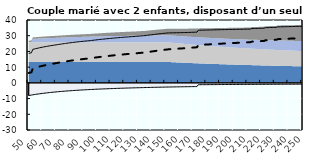
| Category | Coin fiscal moyen (somme des composantes) | Taux moyen d'imposition net en % du salaire brut |
|---|---|---|
| 50.0 | 18.78 | 6.305 |
| 51.0 | 18.967 | 6.52 |
| 52.0 | 19.146 | 6.727 |
| 53.0 | 21.31 | 9.223 |
| 54.0 | 21.528 | 9.475 |
| 55.0 | 21.739 | 9.718 |
| 56.0 | 21.942 | 9.953 |
| 57.0 | 22.138 | 10.179 |
| 58.0 | 22.327 | 10.397 |
| 59.0 | 22.51 | 10.608 |
| 60.0 | 22.687 | 10.812 |
| 61.0 | 22.858 | 11.009 |
| 62.0 | 23.023 | 11.2 |
| 63.0 | 23.184 | 11.385 |
| 64.0 | 23.339 | 11.564 |
| 65.0 | 23.489 | 11.737 |
| 66.0 | 23.635 | 11.905 |
| 67.0 | 23.776 | 12.069 |
| 68.0 | 23.914 | 12.227 |
| 69.0 | 24.047 | 12.381 |
| 70.0 | 24.18 | 12.533 |
| 71.0 | 24.324 | 12.7 |
| 72.0 | 24.464 | 12.862 |
| 73.0 | 24.601 | 13.019 |
| 74.0 | 24.733 | 13.172 |
| 75.0 | 24.862 | 13.321 |
| 76.0 | 24.988 | 13.466 |
| 77.0 | 25.111 | 13.608 |
| 78.0 | 25.23 | 13.746 |
| 79.0 | 25.347 | 13.88 |
| 80.0 | 25.46 | 14.011 |
| 81.0 | 25.571 | 14.138 |
| 82.0 | 25.679 | 14.263 |
| 83.0 | 25.784 | 14.384 |
| 84.0 | 25.887 | 14.503 |
| 85.0 | 25.987 | 14.619 |
| 86.0 | 26.085 | 14.732 |
| 87.0 | 26.181 | 14.843 |
| 88.0 | 26.275 | 14.951 |
| 89.0 | 26.366 | 15.056 |
| 90.0 | 26.456 | 15.16 |
| 91.0 | 26.544 | 15.261 |
| 92.0 | 26.629 | 15.359 |
| 93.0 | 26.713 | 15.456 |
| 94.0 | 26.795 | 15.551 |
| 95.0 | 26.884 | 15.653 |
| 96.0 | 26.992 | 15.778 |
| 97.0 | 27.098 | 15.901 |
| 98.0 | 27.203 | 16.021 |
| 99.0 | 27.305 | 16.139 |
| 100.0 | 27.405 | 16.255 |
| 101.0 | 27.503 | 16.368 |
| 102.0 | 27.6 | 16.479 |
| 103.0 | 27.694 | 16.588 |
| 104.0 | 27.787 | 16.695 |
| 105.0 | 27.877 | 16.799 |
| 106.0 | 27.967 | 16.902 |
| 107.0 | 28.054 | 17.003 |
| 108.0 | 28.14 | 17.102 |
| 109.0 | 28.224 | 17.199 |
| 110.0 | 28.307 | 17.295 |
| 111.0 | 28.388 | 17.389 |
| 112.0 | 28.468 | 17.481 |
| 113.0 | 28.546 | 17.571 |
| 114.0 | 28.623 | 17.66 |
| 115.0 | 28.699 | 17.747 |
| 116.0 | 28.773 | 17.833 |
| 117.0 | 28.846 | 17.917 |
| 118.0 | 28.918 | 18 |
| 119.0 | 28.989 | 18.082 |
| 120.0 | 29.058 | 18.162 |
| 121.0 | 29.127 | 18.241 |
| 122.0 | 29.194 | 18.318 |
| 123.0 | 29.26 | 18.394 |
| 124.0 | 29.325 | 18.469 |
| 125.0 | 29.389 | 18.543 |
| 126.0 | 29.452 | 18.616 |
| 127.0 | 29.514 | 18.687 |
| 128.0 | 29.575 | 18.758 |
| 129.0 | 29.648 | 18.842 |
| 130.0 | 29.72 | 18.926 |
| 131.0 | 29.792 | 19.008 |
| 132.0 | 29.862 | 19.089 |
| 133.0 | 29.931 | 19.169 |
| 134.0 | 30 | 19.248 |
| 135.0 | 30.067 | 19.325 |
| 136.0 | 30.178 | 19.454 |
| 137.0 | 30.292 | 19.585 |
| 138.0 | 30.404 | 19.714 |
| 139.0 | 30.515 | 19.842 |
| 140.0 | 30.624 | 19.967 |
| 141.0 | 30.731 | 20.091 |
| 142.0 | 30.837 | 20.213 |
| 143.0 | 30.941 | 20.334 |
| 144.0 | 31.044 | 20.452 |
| 145.0 | 31.146 | 20.57 |
| 146.0 | 31.246 | 20.685 |
| 147.0 | 31.344 | 20.799 |
| 148.0 | 31.442 | 20.911 |
| 149.0 | 31.538 | 21.022 |
| 150.0 | 31.633 | 21.132 |
| 151.0 | 31.726 | 21.24 |
| 152.0 | 31.771 | 21.318 |
| 153.0 | 31.791 | 21.382 |
| 154.0 | 31.811 | 21.445 |
| 155.0 | 31.831 | 21.507 |
| 156.0 | 31.85 | 21.568 |
| 157.0 | 31.869 | 21.629 |
| 158.0 | 31.888 | 21.689 |
| 159.0 | 31.906 | 21.748 |
| 160.0 | 31.925 | 21.806 |
| 161.0 | 31.943 | 21.863 |
| 162.0 | 31.961 | 21.92 |
| 163.0 | 31.979 | 21.976 |
| 164.0 | 31.997 | 22.032 |
| 165.0 | 32.015 | 22.088 |
| 166.0 | 32.048 | 22.16 |
| 167.0 | 32.081 | 22.232 |
| 168.0 | 32.114 | 22.302 |
| 169.0 | 32.146 | 22.372 |
| 170.0 | 32.178 | 22.441 |
| 171.0 | 32.209 | 22.51 |
| 172.0 | 32.24 | 22.577 |
| 173.0 | 32.271 | 22.644 |
| 174.0 | 33.473 | 24.048 |
| 175.0 | 33.497 | 24.105 |
| 176.0 | 33.521 | 24.162 |
| 177.0 | 33.544 | 24.218 |
| 178.0 | 33.567 | 24.274 |
| 179.0 | 33.59 | 24.329 |
| 180.0 | 33.613 | 24.383 |
| 181.0 | 33.635 | 24.437 |
| 182.0 | 33.657 | 24.49 |
| 183.0 | 33.679 | 24.542 |
| 184.0 | 33.701 | 24.594 |
| 185.0 | 33.723 | 24.646 |
| 186.0 | 33.744 | 24.697 |
| 187.0 | 33.765 | 24.747 |
| 188.0 | 33.786 | 24.797 |
| 189.0 | 33.806 | 24.846 |
| 190.0 | 33.827 | 24.895 |
| 191.0 | 33.847 | 24.943 |
| 192.0 | 33.867 | 24.991 |
| 193.0 | 33.887 | 25.038 |
| 194.0 | 33.907 | 25.085 |
| 195.0 | 33.926 | 25.131 |
| 196.0 | 33.946 | 25.177 |
| 197.0 | 33.965 | 25.222 |
| 198.0 | 33.984 | 25.267 |
| 199.0 | 34.002 | 25.311 |
| 200.0 | 34.021 | 25.355 |
| 201.0 | 34.039 | 25.399 |
| 202.0 | 34.058 | 25.442 |
| 203.0 | 34.076 | 25.485 |
| 204.0 | 34.094 | 25.527 |
| 205.0 | 34.111 | 25.569 |
| 206.0 | 34.129 | 25.61 |
| 207.0 | 34.146 | 25.651 |
| 208.0 | 34.164 | 25.692 |
| 209.0 | 34.181 | 25.732 |
| 210.0 | 34.198 | 25.772 |
| 211.0 | 34.214 | 25.812 |
| 212.0 | 34.231 | 25.851 |
| 213.0 | 34.545 | 26.225 |
| 214.0 | 34.572 | 26.275 |
| 215.0 | 34.599 | 26.325 |
| 216.0 | 34.626 | 26.375 |
| 217.0 | 34.652 | 26.424 |
| 218.0 | 34.678 | 26.472 |
| 219.0 | 34.704 | 26.52 |
| 220.0 | 34.73 | 26.568 |
| 221.0 | 34.755 | 26.615 |
| 222.0 | 34.78 | 26.662 |
| 223.0 | 35.127 | 27.07 |
| 224.0 | 35.15 | 27.114 |
| 225.0 | 35.174 | 27.158 |
| 226.0 | 35.197 | 27.202 |
| 227.0 | 35.22 | 27.245 |
| 228.0 | 35.242 | 27.288 |
| 229.0 | 35.265 | 27.33 |
| 230.0 | 35.287 | 27.372 |
| 231.0 | 35.309 | 27.414 |
| 232.0 | 35.641 | 27.803 |
| 233.0 | 35.661 | 27.842 |
| 234.0 | 35.682 | 27.881 |
| 235.0 | 35.702 | 27.92 |
| 236.0 | 35.722 | 27.959 |
| 237.0 | 35.742 | 27.997 |
| 238.0 | 35.761 | 28.035 |
| 239.0 | 35.781 | 28.072 |
| 240.0 | 35.8 | 28.109 |
| 241.0 | 35.82 | 28.146 |
| 242.0 | 35.839 | 28.183 |
| 243.0 | 35.858 | 28.219 |
| 244.0 | 35.877 | 28.255 |
| 245.0 | 35.895 | 28.291 |
| 246.0 | 35.914 | 28.327 |
| 247.0 | 35.932 | 28.362 |
| 248.0 | 35.95 | 28.397 |
| 249.0 | 35.975 | 28.439 |
| 250.0 | 36.028 | 28.512 |